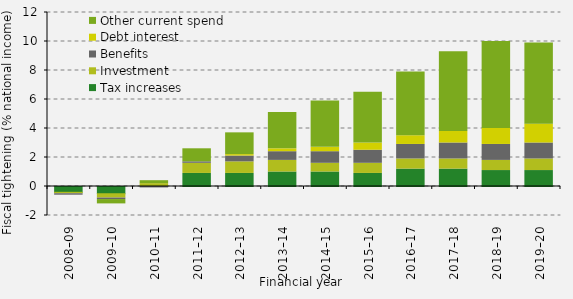
| Category | Tax increases | Investment | Benefits | Debt interest | Other current spend |
|---|---|---|---|---|---|
| 2008–09 | -0.4 | -0.1 | -0.1 | 0 | 0 |
| 2009–10 | -0.5 | -0.3 | -0.1 | 0 | -0.3 |
| 2010–11 | 0 | 0.2 | -0.1 | 0 | 0.2 |
| 2011–12 | 0.9 | 0.7 | 0.1 | 0 | 0.9 |
| 2012–13 | 0.9 | 0.8 | 0.4 | 0.1 | 1.5 |
| 2013–14 | 1 | 0.8 | 0.6 | 0.2 | 2.5 |
| 2014–15 | 1 | 0.6 | 0.8 | 0.3 | 3.2 |
| 2015–16 | 0.9 | 0.7 | 0.9 | 0.5 | 3.5 |
| 2016–17 | 1.2 | 0.7 | 1 | 0.6 | 4.4 |
| 2017–18 | 1.2 | 0.7 | 1.1 | 0.8 | 5.5 |
| 2018–19 | 1.1 | 0.7 | 1.1 | 1.1 | 6 |
| 2019–20 | 1.1 | 0.8 | 1.1 | 1.3 | 5.6 |